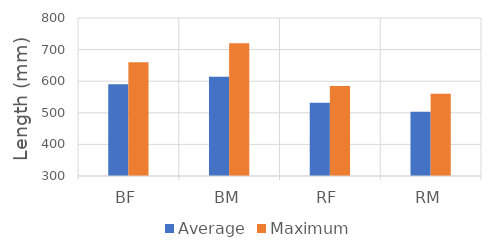
| Category | Average | Maximum |
|---|---|---|
| BF | 590.741 | 660 |
| BM | 614.286 | 720 |
| RF | 532 | 585 |
| RM | 503.654 | 560 |